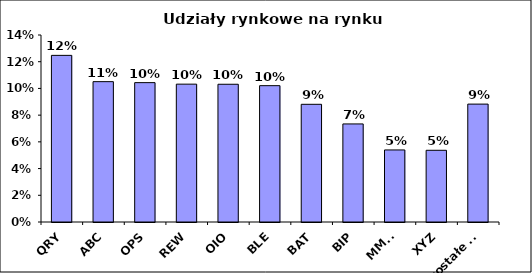
| Category | Series 0 |
|---|---|
| QRY | 0.125 |
| ABC | 0.105 |
| OPS | 0.104 |
| REW | 0.103 |
| OIO | 0.103 |
| BLE | 0.102 |
| BAT | 0.088 |
| BIP | 0.073 |
| MMN | 0.054 |
| XYZ | 0.054 |
| Pozostałe 10 | 0.088 |